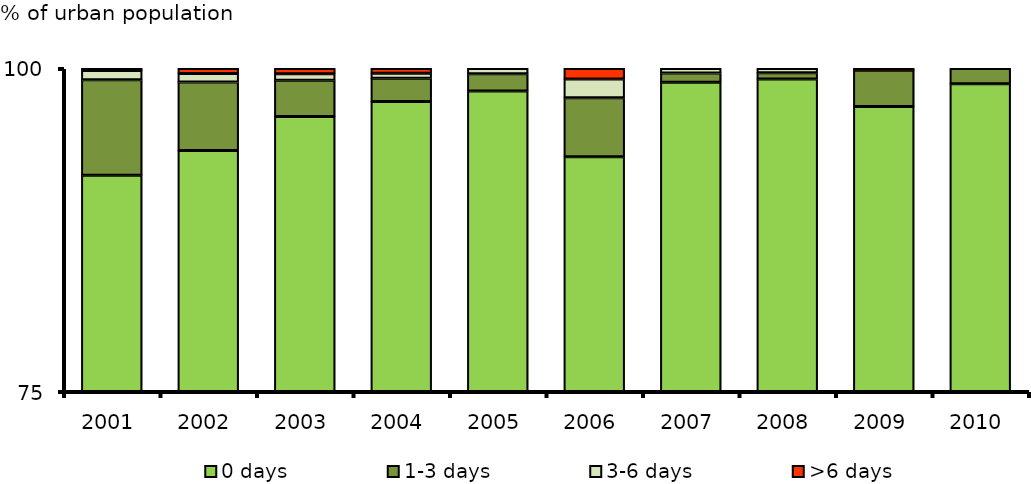
| Category | 0 days | 1-3 days | 3-6 days | >6 days |
|---|---|---|---|---|
| 2001.0 | 91.741 | 7.381 | 0.724 | 0.154 |
| 2002.0 | 93.66 | 5.295 | 0.649 | 0.396 |
| 2003.0 | 96.283 | 2.81 | 0.51 | 0.397 |
| 2004.0 | 97.438 | 1.809 | 0.389 | 0.363 |
| 2005.0 | 98.25 | 1.344 | 0.407 | 0 |
| 2006.0 | 93.176 | 4.563 | 1.455 | 0.807 |
| 2007.0 | 98.945 | 0.698 | 0.357 | 0 |
| 2008.0 | 99.194 | 0.467 | 0.338 | 0 |
| 2009.0 | 97.068 | 2.787 | 0 | 0.144 |
| 2010.0 | 98.816 | 1.184 | 0 | 0 |